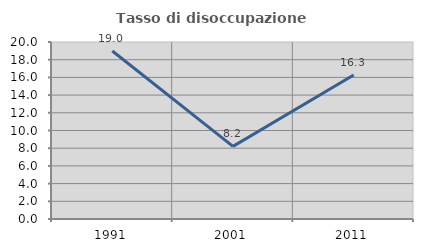
| Category | Tasso di disoccupazione giovanile  |
|---|---|
| 1991.0 | 18.981 |
| 2001.0 | 8.207 |
| 2011.0 | 16.273 |